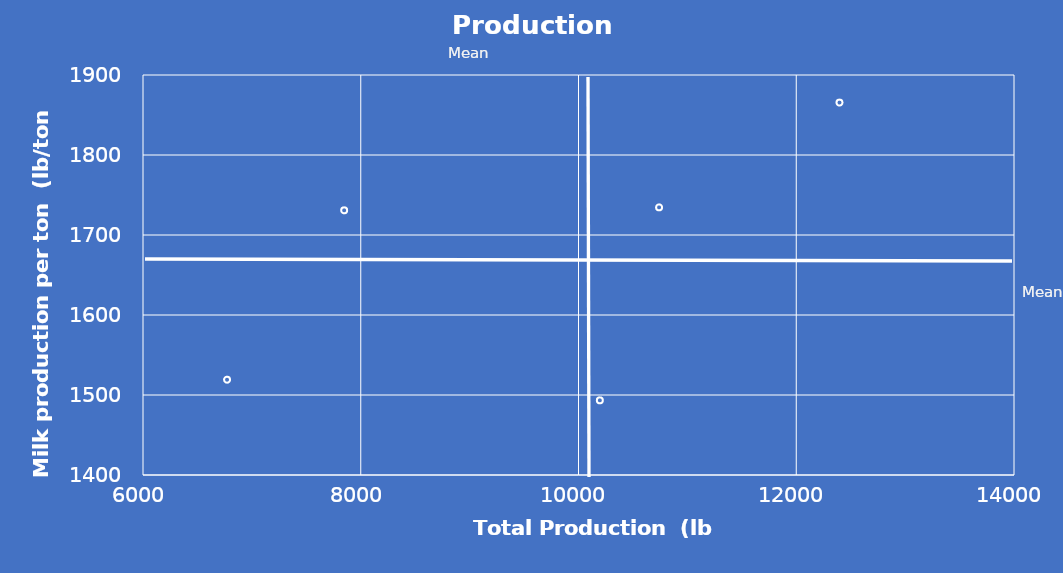
| Category | Series 0 |
|---|---|
| 6772.08 | 1519.13 |
| 7847.52 | 1730.84 |
| 10196.0 | 1493.32 |
| 12397.0 | 1865.51 |
| 10740.0 | 1734.55 |